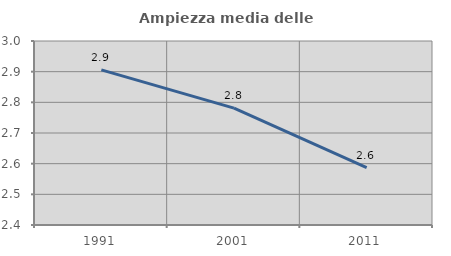
| Category | Ampiezza media delle famiglie |
|---|---|
| 1991.0 | 2.906 |
| 2001.0 | 2.781 |
| 2011.0 | 2.587 |